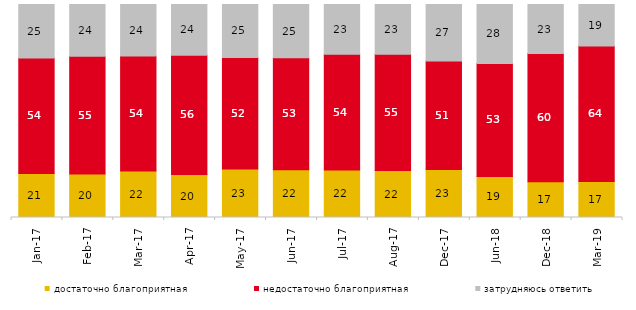
| Category | достаточно благоприятная | недостаточно благоприятная | затрудняюсь ответить |
|---|---|---|---|
| 2017-01-01 | 20.7 | 54.15 | 25.15 |
| 2017-02-01 | 20.4 | 55.3 | 24.3 |
| 2017-03-01 | 21.8 | 54 | 24.2 |
| 2017-04-01 | 20.15 | 56 | 23.75 |
| 2017-05-01 | 22.8 | 52.35 | 24.85 |
| 2017-06-01 | 22.4 | 52.6 | 25 |
| 2017-07-01 | 22.3 | 54.3 | 23.35 |
| 2017-08-01 | 22.05 | 54.65 | 23.3 |
| 2017-12-01 | 22.5 | 51 | 26.5 |
| 2018-06-01 | 19.3 | 53.05 | 27.65 |
| 2018-12-01 | 16.75 | 60.2 | 23.05 |
| 2019-03-01 | 16.957 | 63.55 | 19.493 |